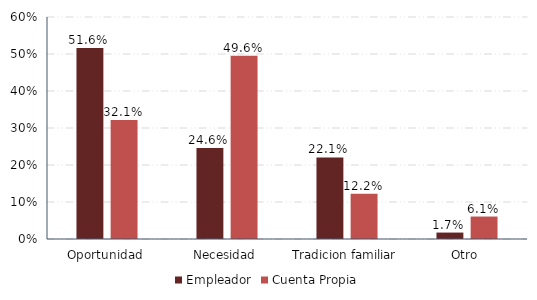
| Category | Empleador | Cuenta Propia |
|---|---|---|
| Oportunidad | 0.516 | 0.321 |
| Necesidad | 0.246 | 0.496 |
| Tradicion familiar | 0.22 | 0.122 |
| Otro | 0.017 | 0.061 |